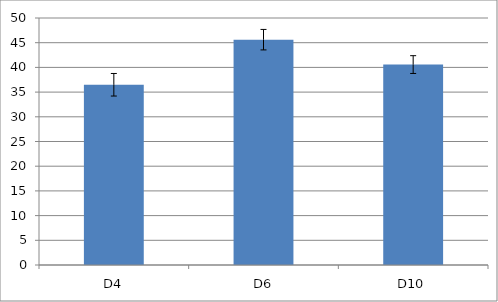
| Category | Series 0 |
|---|---|
| D4 | 36.486 |
| D6 | 45.614 |
| D10 | 40.572 |